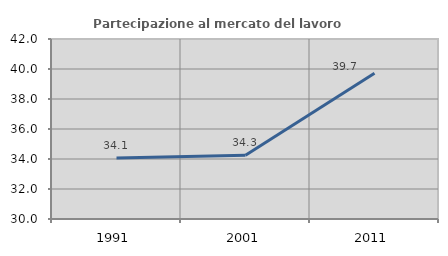
| Category | Partecipazione al mercato del lavoro  femminile |
|---|---|
| 1991.0 | 34.072 |
| 2001.0 | 34.257 |
| 2011.0 | 39.715 |